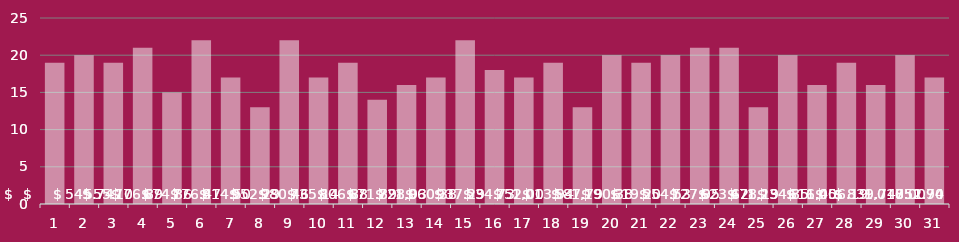
| Category | Customer |
|---|---|
| 1.0 | 19 |
| 2.0 | 20 |
| 3.0 | 19 |
| 4.0 | 21 |
| 5.0 | 15 |
| 6.0 | 22 |
| 7.0 | 17 |
| 8.0 | 13 |
| 9.0 | 22 |
| 10.0 | 17 |
| 11.0 | 19 |
| 12.0 | 14 |
| 13.0 | 16 |
| 14.0 | 17 |
| 15.0 | 22 |
| 16.0 | 18 |
| 17.0 | 17 |
| 18.0 | 19 |
| 19.0 | 13 |
| 20.0 | 20 |
| 21.0 | 19 |
| 22.0 | 20 |
| 23.0 | 21 |
| 24.0 | 21 |
| 25.0 | 13 |
| 26.0 | 20 |
| 27.0 | 16 |
| 28.0 | 19 |
| 29.0 | 16 |
| 30.0 | 20 |
| 31.0 | 17 |